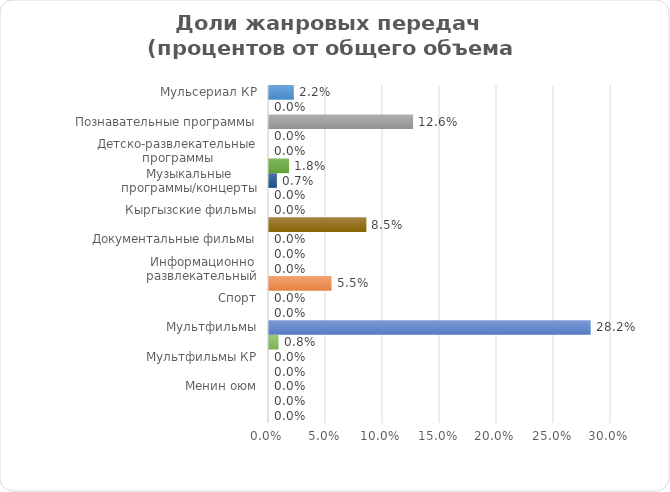
| Category | Series 0 |
|---|---|
| Мульсериал КР | 0.022 |
| Реалити шоу | 0 |
| Познавательные программы | 0.126 |
| Социальные программы | 0 |
| Детско-развлекательные программы | 0 |
| Викторина/интеллектуальные передачи | 0.018 |
| Музыкальные программы/концерты | 0.007 |
| Развлекательные программы | 0 |
| Кыргызские фильмы | 0 |
| Художественные фильмы | 0.085 |
| Документальные фильмы | 0 |
| Сериалы | 0 |
| Информационно развлекательный | 0 |
| Мультсериал | 0.055 |
| Спорт | 0 |
| Ток шоу | 0 |
| Мультфильмы | 0.282 |
| Эфирное оформление и промо | 0.008 |
| Мультфильмы КР | 0 |
| Сериалы КР | 0 |
| Менин оюм | 0 |